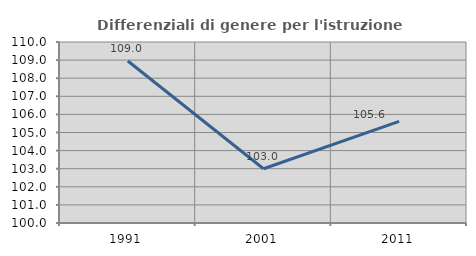
| Category | Differenziali di genere per l'istruzione superiore |
|---|---|
| 1991.0 | 108.951 |
| 2001.0 | 102.995 |
| 2011.0 | 105.617 |